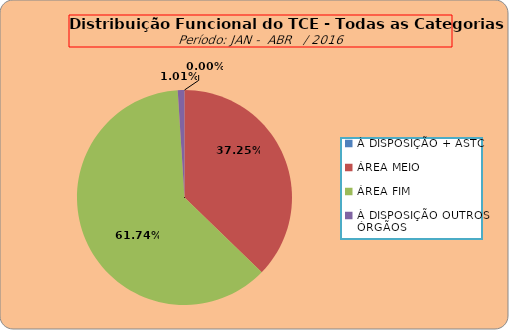
| Category | Series 0 |
|---|---|
| À DISPOSIÇÃO + ASTC | 0 |
| ÁREA MEIO | 184 |
| ÁREA FIM | 305 |
| À DISPOSIÇÃO OUTROS ÓRGÃOS | 5 |